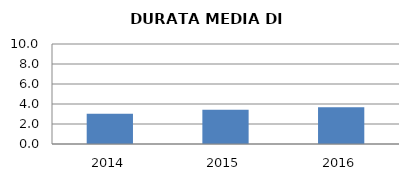
| Category | 2014 2015 2016 |
|---|---|
| 2014.0 | 3.037 |
| 2015.0 | 3.438 |
| 2016.0 | 3.667 |